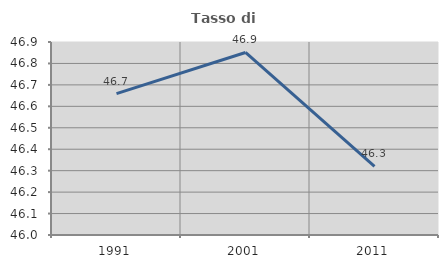
| Category | Tasso di occupazione   |
|---|---|
| 1991.0 | 46.659 |
| 2001.0 | 46.851 |
| 2011.0 | 46.32 |